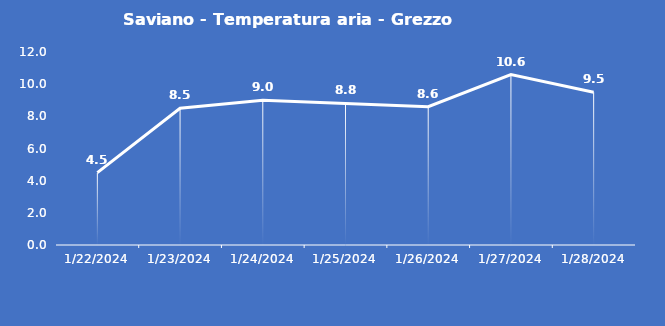
| Category | Saviano - Temperatura aria - Grezzo (°C) |
|---|---|
| 1/22/24 | 4.5 |
| 1/23/24 | 8.5 |
| 1/24/24 | 9 |
| 1/25/24 | 8.8 |
| 1/26/24 | 8.6 |
| 1/27/24 | 10.6 |
| 1/28/24 | 9.5 |